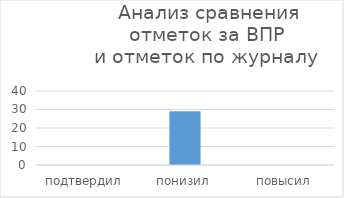
| Category | Series 0 |
|---|---|
| подтвердил | 0 |
| понизил | 29 |
| повысил | 0 |